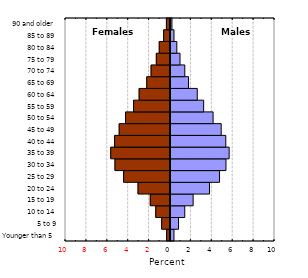
| Category | Series 0 |
|---|---|
| Younger than 5 | 0.332 |
| 5 to 9 | 0.766 |
| 10 to 14 | 1.365 |
| 15 to 19 | 2.166 |
| 20 to 24 | 3.732 |
| 25 to 29 | 4.693 |
| 30 to 34 | 5.308 |
| 35 to 39 | 5.613 |
| 40 to 44 | 5.291 |
| 45 to 49 | 4.851 |
| 50 to 54 | 4.075 |
| 55 to 59 | 3.174 |
| 60 to 64 | 2.558 |
| 65 to 69 | 1.723 |
| 70 to 74 | 1.369 |
| 75 to 79 | 0.911 |
| 80 to 84 | 0.606 |
| 85 to 89 | 0.333 |
| 90 and older | 0.139 |